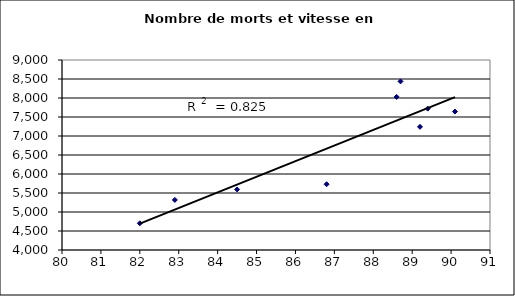
| Category | Series 0 |
|---|---|
| 88.7 | 8437 |
| 88.6 | 8029 |
| 90.1 | 7643 |
| 89.4 | 7720 |
| 89.2 | 7242 |
| 86.8 | 5731 |
| 84.5 | 5593 |
| 82.9 | 5318 |
| 82.0 | 4703 |